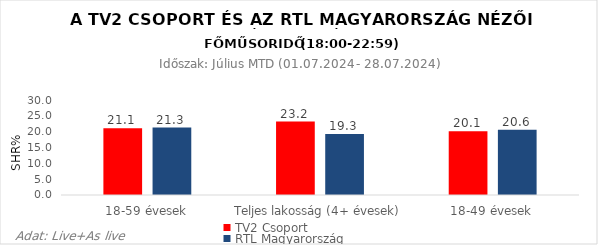
| Category | TV2 Csoport | RTL Magyarország |
|---|---|---|
| 18-59 évesek | 21.1 | 21.3 |
| Teljes lakosság (4+ évesek) | 23.2 | 19.3 |
| 18-49 évesek | 20.1 | 20.6 |